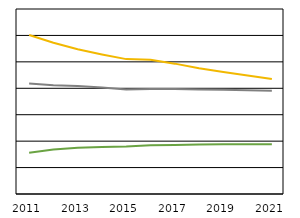
| Category | III. | II. | I. |
|---|---|---|---|
| 2011.0 | 120308 | 31201 | 83605 |
| 2012.0 | 114453 | 33734 | 82238 |
| 2013.0 | 109532 | 35090 | 81688 |
| 2014.0 | 105622 | 35593 | 80542 |
| 2015.0 | 102070 | 35856 | 79052 |
| 2016.0 | 101588 | 36888 | 79482 |
| 2017.0 | 98651 | 37159 | 79378 |
| 2018.0 | 95121 | 37497 | 79066 |
| 2019.0 | 92260 | 37682 | 78889 |
| 2020.0 | 89630 | 37705 | 78532 |
| 2021.0 | 86976 | 37630 | 78117 |